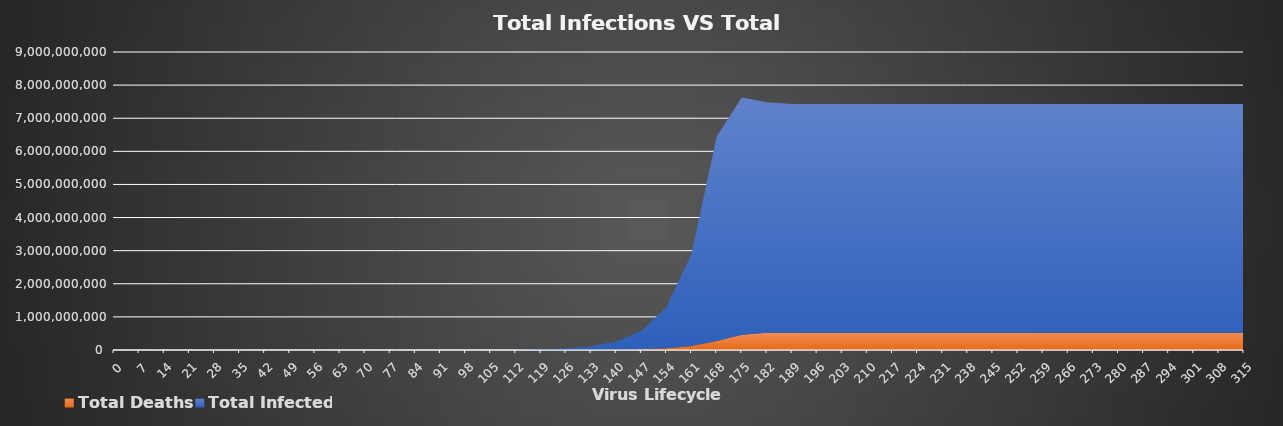
| Category | Total Deaths | Total Infected |
|---|---|---|
| 0.0 | 0.04 | 2 |
| 7.0 | 0.246 | 7.28 |
| 14.0 | 0.793 | 21.118 |
| 21.0 | 2.231 | 57.369 |
| 28.0 | 5.985 | 151.604 |
| 35.0 | 15.705 | 394.687 |
| 42.0 | 40.685 | 1016.869 |
| 49.0 | 104.381 | 2596.921 |
| 56.0 | 265.526 | 6577.905 |
| 63.0 | 669.994 | 16528.459 |
| 70.0 | 1677.119 | 41201.004 |
| 77.0 | 4164.759 | 101883.333 |
| 84.0 | 10259.677 | 249917.96 |
| 91.0 | 25071.068 | 608086.928 |
| 98.0 | 60768.929 | 1467508.862 |
| 105.0 | 146094.101 | 3512486.317 |
| 112.0 | 348335.742 | 8337554.888 |
| 119.0 | 823661.856 | 19625634.609 |
| 126.0 | 1931328.836 | 45807854.052 |
| 133.0 | 4490453.209 | 106012541.856 |
| 140.0 | 10351914.327 | 243245586.388 |
| 147.0 | 23660128.806 | 553314426.998 |
| 154.0 | 53610321.41 | 1247690088.387 |
| 161.0 | 120415679.292 | 2788798100.211 |
| 168.0 | 268095150.508 | 6178320792.071 |
| 175.0 | 463525176.145 | 7161322478.315 |
| 182.0 | 520059234.018 | 6965892452.679 |
| 189.0 | 520059234.018 | 6909358394.806 |
| 196.0 | 520059234.018 | 6909358394.806 |
| 203.0 | 520059234.018 | 6909358394.806 |
| 210.0 | 520059234.018 | 6909358394.806 |
| 217.0 | 520059234.018 | 6909358394.806 |
| 224.0 | 520059234.018 | 6909358394.806 |
| 231.0 | 520059234.018 | 6909358394.806 |
| 238.0 | 520059234.018 | 6909358394.806 |
| 245.0 | 520059234.018 | 6909358394.806 |
| 252.0 | 520059234.018 | 6909358394.806 |
| 259.0 | 520059234.018 | 6909358394.806 |
| 266.0 | 520059234.018 | 6909358394.806 |
| 273.0 | 520059234.018 | 6909358394.806 |
| 280.0 | 520059234.018 | 6909358394.806 |
| 287.0 | 520059234.018 | 6909358394.806 |
| 294.0 | 520059234.018 | 6909358394.806 |
| 301.0 | 520059234.018 | 6909358394.806 |
| 308.0 | 520059234.018 | 6909358394.806 |
| 315.0 | 520059234.018 | 6909358394.806 |